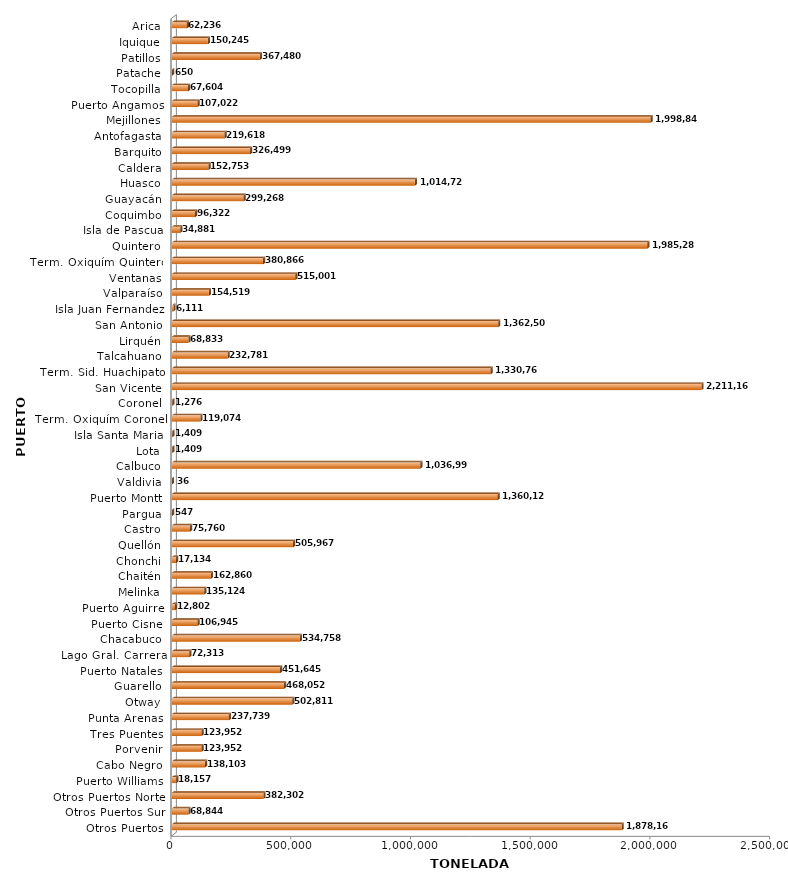
| Category | Series 0 |
|---|---|
| Otros Puertos | 1878163.466 |
| Otros Puertos Sur | 68843.867 |
| Otros Puertos Norte | 382302.029 |
| Puerto Williams | 18157 |
| Cabo Negro | 138103 |
| Porvenir | 123952 |
| Tres Puentes | 123952 |
| Punta Arenas | 237739.373 |
| Otway | 502811 |
| Guarello | 468051.943 |
| Puerto Natales | 451645 |
| Lago Gral. Carrera | 72313 |
| Chacabuco | 534758.175 |
| Puerto Cisne | 106945 |
| Puerto Aguirre | 12801.6 |
| Melinka | 135124 |
| Chaitén | 162860 |
| Chonchi | 17134 |
| Quellón | 505967 |
| Castro | 75760 |
| Pargua | 547 |
| Puerto Montt | 1360125 |
| Valdivia | 36 |
| Calbuco | 1036992.5 |
| Lota | 1409 |
| Isla Santa Maria | 1409 |
| Term. Oxiquím Coronel | 119074.479 |
| Coronel | 1276 |
| San Vicente | 2211160.575 |
| Term. Sid. Huachipato | 1330759.943 |
| Talcahuano | 232781 |
| Lirquén | 68833 |
| San Antonio | 1362500.723 |
| Isla Juan Fernandez | 6111 |
| Valparaíso | 154519.2 |
| Ventanas | 515001.076 |
| Term. Oxiquím Quintero | 380865.936 |
| Quintero | 1985282.375 |
| Isla de Pascua | 34880.648 |
| Coquimbo | 96322 |
| Guayacán | 299267.611 |
| Huasco | 1014723 |
| Caldera | 152753.225 |
| Barquito | 326499.125 |
| Antofagasta | 219617.513 |
| Mejillones | 1998846.95 |
| Puerto Angamos | 107022.287 |
| Tocopilla | 67604 |
| Patache | 650 |
| Patillos | 367480 |
| Iquique | 150244.992 |
| Arica | 62235.813 |